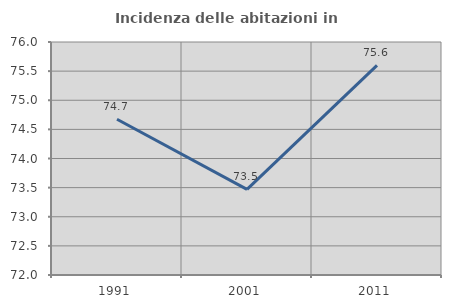
| Category | Incidenza delle abitazioni in proprietà  |
|---|---|
| 1991.0 | 74.674 |
| 2001.0 | 73.469 |
| 2011.0 | 75.597 |